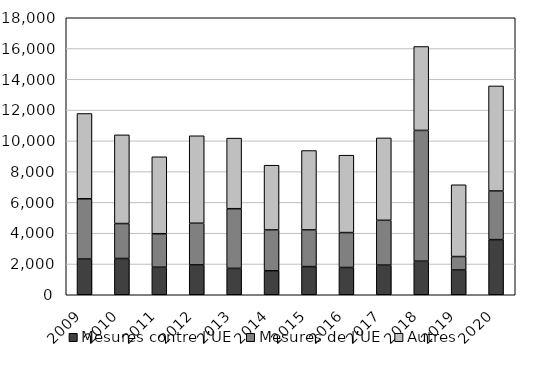
| Category | Mesures contre l’UE | Mesures de l’UE | Autres |
|---|---|---|---|
| 2009.0 | 2320 | 3916 | 5544 |
| 2010.0 | 2357 | 2270 | 5764 |
| 2011.0 | 1788 | 2178 | 5000 |
| 2012.0 | 1939 | 2709 | 5684 |
| 2013.0 | 1713 | 3879 | 4587 |
| 2014.0 | 1556 | 2656 | 4206 |
| 2015.0 | 1830 | 2383 | 5159 |
| 2016.0 | 1772 | 2269 | 5029 |
| 2017.0 | 1926 | 2912 | 5354 |
| 2018.0 | 2181 | 8498 | 5453 |
| 2019.0 | 1608 | 875 | 4665 |
| 2020.0 | 3583 | 3160 | 6827 |